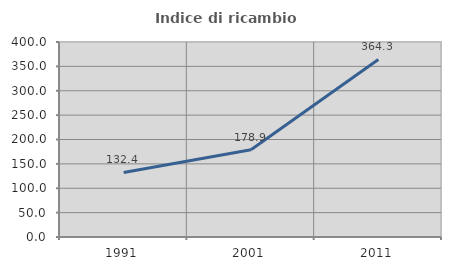
| Category | Indice di ricambio occupazionale  |
|---|---|
| 1991.0 | 132.353 |
| 2001.0 | 178.947 |
| 2011.0 | 364.286 |